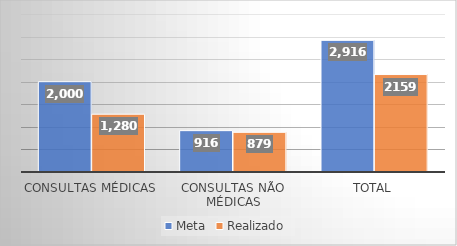
| Category | Meta | Realizado |
|---|---|---|
| Consultas Médicas | 2000 | 1280 |
| Consultas não médicas | 916 | 879 |
| Total | 2916 | 2159 |